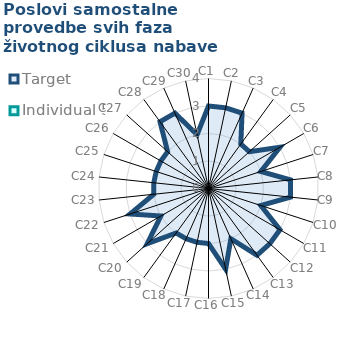
| Category | Target | Individual 5 |
|---|---|---|
| C1 | 3 | 0 |
| C2 | 3 | 0 |
| C3 | 3 | 0 |
| C4 | 2 | 0 |
| C5 | 2 | 0 |
| C6 | 3 | 0 |
| C7 | 2 | 0 |
| C8 | 3 | 0 |
| C9 | 3 | 0 |
| C10 | 2 | 0 |
| C11 | 3 | 0 |
| C12 | 3 | 0 |
| C13 | 3 | 0 |
| C14 | 2 | 0 |
| C15 | 3 | 0 |
| C16 | 2 | 0 |
| C17 | 2 | 0 |
| C18 | 2 | 0 |
| C19 | 2 | 0 |
| C20 | 3 | 0 |
| C21 | 2 | 0 |
| C22 | 3 | 0 |
| C23 | 2 | 0 |
| C24 | 2 | 0 |
| C25 | 2 | 0 |
| C26 | 2 | 0 |
| C27 | 2 | 0 |
| C28 | 3 | 0 |
| C29 | 3 | 0 |
| C30 | 2 | 0 |